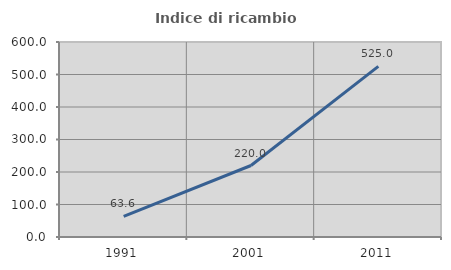
| Category | Indice di ricambio occupazionale  |
|---|---|
| 1991.0 | 63.636 |
| 2001.0 | 220 |
| 2011.0 | 525 |